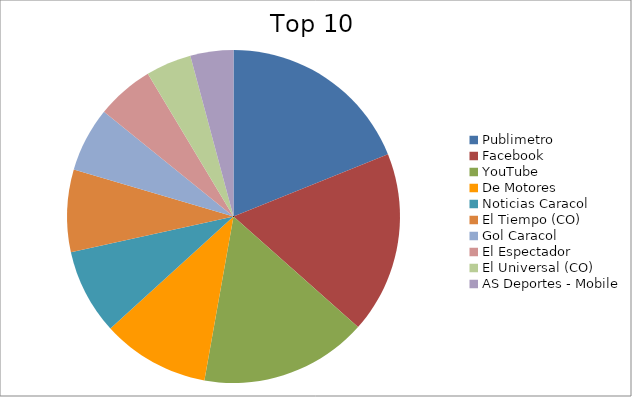
| Category | Series 0 |
|---|---|
| Publimetro | 10.37 |
| Facebook | 9.68 |
| YouTube | 8.91 |
| De Motores | 5.73 |
| Noticias Caracol | 4.56 |
| El Tiempo (CO) | 4.39 |
| Gol Caracol | 3.43 |
| El Espectador | 3.06 |
| El Universal (CO) | 2.43 |
| AS Deportes - Mobile | 2.29 |